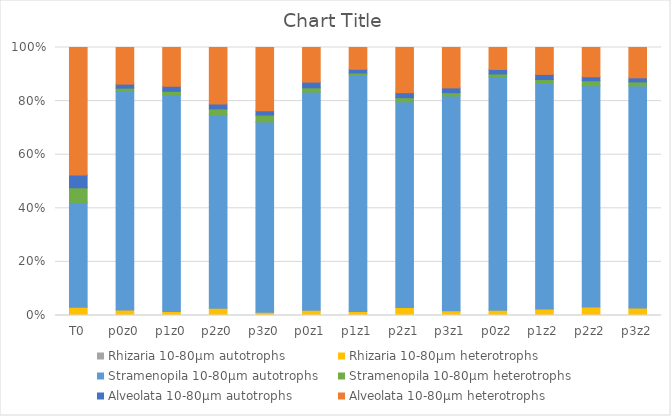
| Category | Rhizaria | Stramenopila | Alveolata |
|---|---|---|---|
| T0 | 1386 | 2412 | 21137.5 |
| p0z0 | 1016.667 | 577 | 6766 |
| p1z0 | 731.333 | 634.667 | 7159.333 |
| p2z0 | 1321 | 1055 | 10365.333 |
| p3z0 | 606.5 | 1246 | 11534.5 |
| p0z1 | 971.667 | 780.667 | 6344 |
| p1z1 | 741.667 | 278.667 | 4002.667 |
| p2z1 | 1472.333 | 769.667 | 8320.333 |
| p3z1 | 888 | 608.5 | 7389.5 |
| p0z2 | 969 | 513 | 3986 |
| p1z2 | 1161 | 697 | 4896.667 |
| p2z2 | 1576.667 | 923.333 | 5358 |
| p3z2 | 1360 | 723 | 5532 |